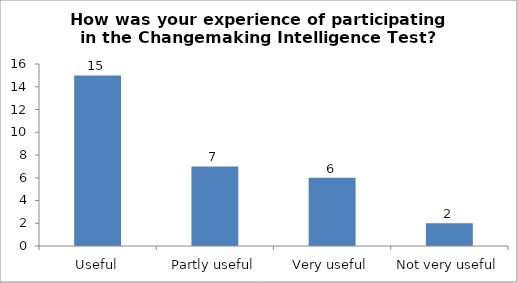
| Category | How was your experience of participating in the Changemaking Intelligence Test? |
|---|---|
| Useful | 15 |
| Partly useful | 7 |
| Very useful | 6 |
| Not very useful | 2 |